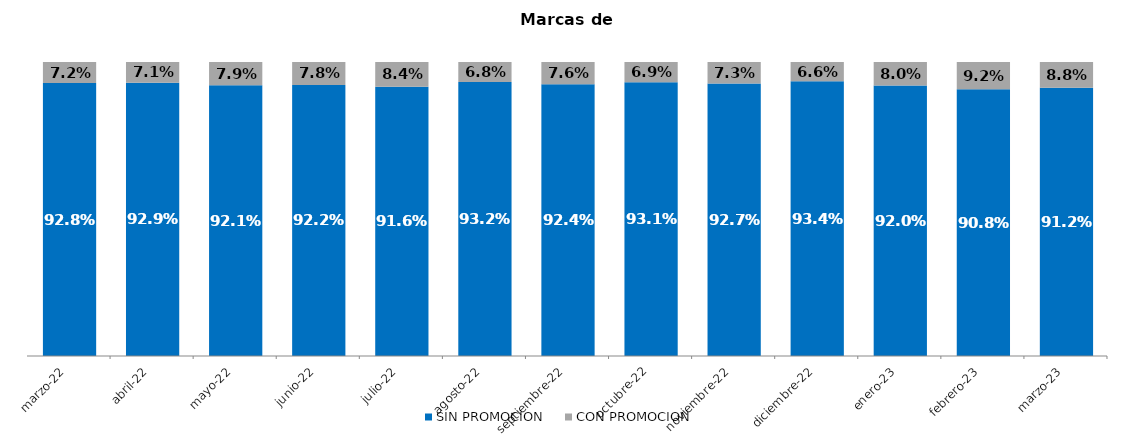
| Category | SIN PROMOCION   | CON PROMOCION   |
|---|---|---|
| 2022-03-01 | 0.928 | 0.072 |
| 2022-04-01 | 0.929 | 0.071 |
| 2022-05-01 | 0.921 | 0.079 |
| 2022-06-01 | 0.922 | 0.078 |
| 2022-07-01 | 0.916 | 0.084 |
| 2022-08-01 | 0.932 | 0.068 |
| 2022-09-01 | 0.924 | 0.076 |
| 2022-10-01 | 0.931 | 0.069 |
| 2022-11-01 | 0.927 | 0.073 |
| 2022-12-01 | 0.934 | 0.066 |
| 2023-01-01 | 0.92 | 0.08 |
| 2023-02-01 | 0.908 | 0.092 |
| 2023-03-01 | 0.912 | 0.088 |